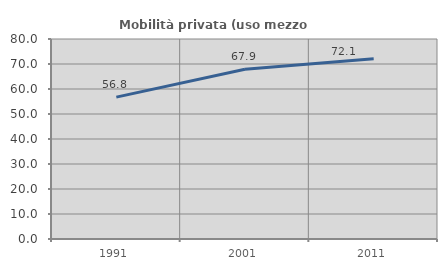
| Category | Mobilità privata (uso mezzo privato) |
|---|---|
| 1991.0 | 56.752 |
| 2001.0 | 67.904 |
| 2011.0 | 72.052 |